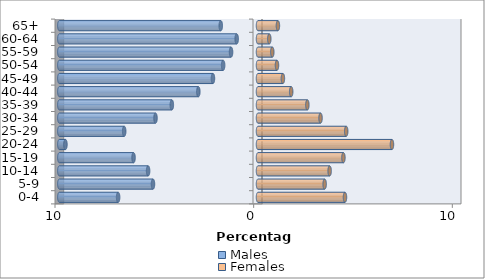
| Category | Males | Females |
|---|---|---|
| 0-4 | -7.041 | 4.378 |
| 5-9 | -5.286 | 3.355 |
| 10-14 | -5.532 | 3.605 |
| 15-19 | -6.265 | 4.3 |
| 20-24 | -9.692 | 6.743 |
| 25-29 | -6.735 | 4.44 |
| 30-34 | -5.16 | 3.147 |
| 35-39 | -4.338 | 2.484 |
| 40-44 | -3.003 | 1.671 |
| 45-49 | -2.267 | 1.253 |
| 50-54 | -1.755 | 0.955 |
| 55-59 | -1.356 | 0.719 |
| 60-64 | -1.073 | 0.568 |
| 65+ | -1.874 | 1.002 |